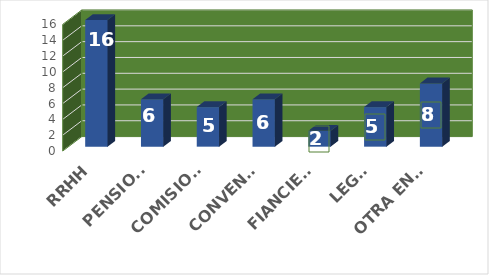
| Category | Series 0 |
|---|---|
| RRHH | 16 |
| PENSIONES | 6 |
| COMISIONES | 5 |
| CONVENIOS | 6 |
| FIANCIERA  | 2 |
| LEGAL | 5 |
| OTRA ENTIDAD  | 8 |